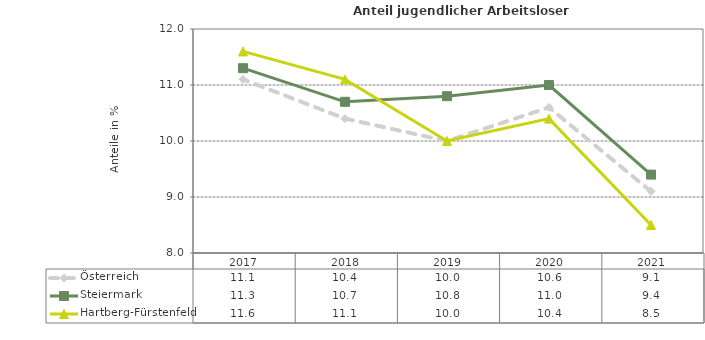
| Category | Österreich | Steiermark | Hartberg-Fürstenfeld |
|---|---|---|---|
| 2021.0 | 9.1 | 9.4 | 8.5 |
| 2020.0 | 10.6 | 11 | 10.4 |
| 2019.0 | 10 | 10.8 | 10 |
| 2018.0 | 10.4 | 10.7 | 11.1 |
| 2017.0 | 11.1 | 11.3 | 11.6 |